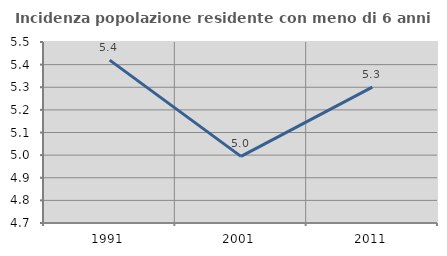
| Category | Incidenza popolazione residente con meno di 6 anni |
|---|---|
| 1991.0 | 5.42 |
| 2001.0 | 4.994 |
| 2011.0 | 5.3 |